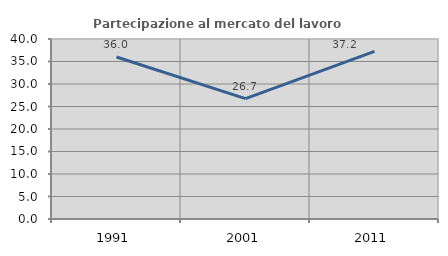
| Category | Partecipazione al mercato del lavoro  femminile |
|---|---|
| 1991.0 | 35.989 |
| 2001.0 | 26.744 |
| 2011.0 | 37.234 |